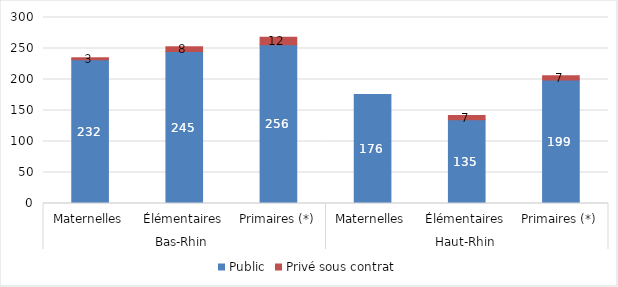
| Category | Public | Privé sous contrat |
|---|---|---|
| 0 | 232 | 3 |
| 1 | 245 | 8 |
| 2 | 256 | 12 |
| 3 | 176 | 0 |
| 4 | 135 | 7 |
| 5 | 199 | 7 |